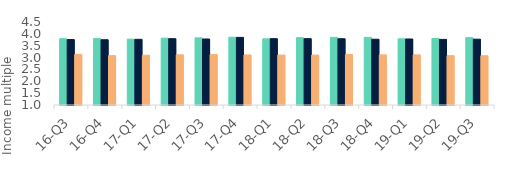
| Category | First-time
buyers | Homemovers | Homowner remortgaging |
|---|---|---|---|
| 16-Q3 | 3.796 | 3.759 | 3.134 |
| 16-Q4 | 3.8 | 3.752 | 3.08 |
| 17-Q1 | 3.776 | 3.77 | 3.098 |
| 17-Q2 | 3.818 | 3.796 | 3.115 |
| 17-Q3 | 3.832 | 3.784 | 3.128 |
| 17-Q4 | 3.858 | 3.852 | 3.11 |
| 18-Q1 | 3.79 | 3.797 | 3.106 |
| 18-Q2 | 3.841 | 3.797 | 3.103 |
| 18-Q3 | 3.853 | 3.794 | 3.127 |
| 18-Q4 | 3.852 | 3.774 | 3.114 |
| 19-Q1 | 3.79 | 3.784 | 3.114 |
| 19-Q2 | 3.805 | 3.766 | 3.082 |
| 19-Q3 | 3.841 | 3.776 | 3.077 |